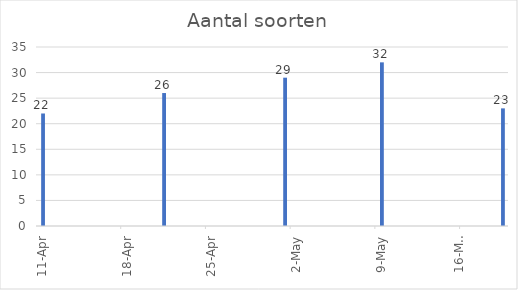
| Category | Aantal soorten |
|---|---|
| 2021-04-11 | 22 |
| 2021-04-21 | 26 |
| 2021-05-01 | 29 |
| 2021-05-09 | 32 |
| 2021-05-19 | 23 |